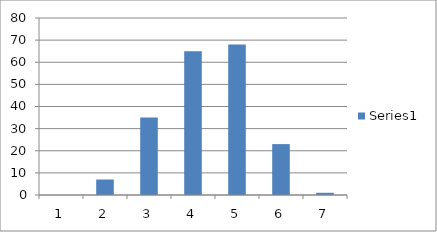
| Category | Series 0 |
|---|---|
| 0 | 0 |
| 1 | 7 |
| 2 | 35 |
| 3 | 65 |
| 4 | 68 |
| 5 | 23 |
| 6 | 1 |